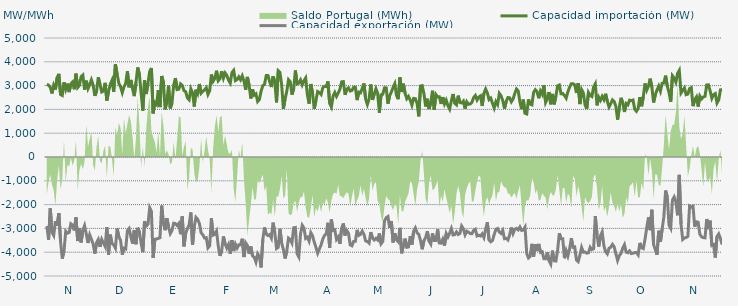
| Category | Capacidad importación (MW) | Capacidad exportación (MW) |
|---|---|---|
| 0 | 3058.125 | -2902.5 |
| 1900-01-01 | 3018.75 | -3474.375 |
| 1900-01-02 | 2925.625 | -2158.375 |
| 1900-01-03 | 2670.667 | -3157.5 |
| 1900-01-04 | 3015 | -3296.25 |
| 1900-01-05 | 2835.25 | -2693.125 |
| 1900-01-06 | 3337.5 | -2882.083 |
| 1900-01-07 | 3493.125 | -2358.75 |
| 1900-01-08 | 2626.042 | -3555 |
| 1900-01-09 | 2583.542 | -4267.5 |
| 1900-01-10 | 3140.625 | -3948.75 |
| 1900-01-11 | 2844.375 | -3122.5 |
| 1900-01-12 | 3082.5 | -3200.625 |
| 1900-01-13 | 2726.25 | -3170.625 |
| 1900-01-14 | 3071.25 | -2806.875 |
| 1900-01-15 | 3151.875 | -2865 |
| 1900-01-16 | 2845.417 | -3084.375 |
| 1900-01-17 | 3500.625 | -2536.875 |
| 1900-01-18 | 2921.75 | -3531.625 |
| 1900-01-19 | 3012.625 | -2985.75 |
| 1900-01-20 | 3378.75 | -3590.625 |
| 1900-01-21 | 3442.5 | -3078.75 |
| 1900-01-22 | 2829.167 | -2881.042 |
| 1900-01-23 | 3205.833 | -3234.375 |
| 1900-01-24 | 2873.625 | -3613.125 |
| 1900-01-25 | 3038.333 | -3270 |
| 1900-01-26 | 3245.625 | -3459.375 |
| 1900-01-27 | 3029.167 | -3656.25 |
| 1900-01-28 | 2571.042 | -4057.5 |
| 1900-01-29 | 2766.125 | -3596.417 |
| 1900-01-30 | 3348.75 | -3465 |
| 1900-01-31 | 3046.333 | -3774.375 |
| 1900-02-01 | 2732.708 | -3460.042 |
| 1900-02-02 | 2770.75 | -3616.875 |
| 1900-02-03 | 3116.25 | -3757.75 |
| 1900-02-04 | 2370.5 | -2949.375 |
| 1900-02-05 | 2758.625 | -4102.5 |
| 1900-02-06 | 3054.167 | -3262.5 |
| 1900-02-07 | 3221.875 | -3637.5 |
| 1900-02-08 | 2734.792 | -3695.625 |
| 1900-02-09 | 3901.875 | -3830.625 |
| 1900-02-10 | 3478.125 | -3007.5 |
| 1900-02-11 | 3100.208 | -3343.125 |
| 1900-02-12 | 2951.458 | -3500.625 |
| 1900-02-13 | 2703.125 | -4100.625 |
| 1900-02-14 | 2949.667 | -3832.5 |
| 1900-02-15 | 3092.292 | -3864.375 |
| 1900-02-16 | 3609.375 | -3088.125 |
| 1900-02-17 | 2928.75 | -3003.75 |
| 1900-02-18 | 3238.333 | -3346.875 |
| 1900-02-19 | 2865.417 | -3639.375 |
| 1900-02-20 | 2557.917 | -3067.5 |
| 1900-02-21 | 3131.667 | -3665.625 |
| 1900-02-22 | 3761.25 | -2973.625 |
| 1900-02-23 | 3468.542 | -3153.75 |
| 1900-02-24 | 2673.75 | -3622.5 |
| 1900-02-25 | 1945.625 | -3999.375 |
| 1900-02-26 | 3222.083 | -2703.875 |
| 1900-02-27 | 2645.458 | -2900.625 |
| 1900-02-28 | 3097.5 | -2827.5 |
| 1900-02-28 | 3595.208 | -2128.75 |
| 1900-03-01 | 3741.458 | -2283.75 |
| 1900-03-02 | 1833.125 | -4242.5 |
| 1900-03-03 | 2294.25 | -3457.125 |
| 1900-03-04 | 2210.833 | -3444.375 |
| 1900-03-05 | 2808.75 | -3420 |
| 1900-03-06 | 2098.083 | -3391.875 |
| 1900-03-07 | 3404.792 | -2041.875 |
| 1900-03-08 | 3136.875 | -2790.292 |
| 1900-03-09 | 2001.25 | -3075.75 |
| 1900-03-10 | 2334.583 | -2570.625 |
| 1900-03-11 | 2998.542 | -2932.5 |
| 1900-03-12 | 2041.583 | -3219.375 |
| 1900-03-13 | 2261.875 | -3091.875 |
| 1900-03-14 | 3017.292 | -2780.625 |
| 1900-03-15 | 3316.667 | -2796 |
| 1900-03-16 | 2831.875 | -2880.375 |
| 1900-03-17 | 2848.875 | -2791.375 |
| 1900-03-18 | 3072.083 | -3242.5 |
| 1900-03-19 | 3008.75 | -2494.125 |
| 1900-03-20 | 2789.75 | -3753.75 |
| 1900-03-21 | 2740.75 | -3208.125 |
| 1900-03-22 | 2484.167 | -3015 |
| 1900-03-23 | 2405.083 | -2845.208 |
| 1900-03-24 | 2862.542 | -2330.625 |
| 1900-03-25 | 2704.875 | -3693.75 |
| 1900-03-26 | 2121.458 | -2932.25 |
| 1900-03-27 | 2826.875 | -2536.458 |
| 1900-03-28 | 2666.25 | -2617.875 |
| 1900-03-29 | 3068.375 | -2797.625 |
| 1900-03-30 | 2681.458 | -3181.875 |
| 1900-03-31 | 2762.167 | -3268.125 |
| 1900-04-01 | 2816.458 | -3403.125 |
| 1900-04-02 | 2908.75 | -3388.125 |
| 1900-04-03 | 2628.458 | -3817.5 |
| 1900-04-04 | 2784.5 | -3729.375 |
| 1900-04-05 | 3466.875 | -2575.375 |
| 1900-04-06 | 3180 | -3284.375 |
| 1900-04-07 | 3301.25 | -3251.25 |
| 1900-04-08 | 3624.375 | -3114.375 |
| 1900-04-09 | 3203.333 | -3733.125 |
| 1900-04-10 | 3288.125 | -4155 |
| 1900-04-11 | 3606.25 | -3943.125 |
| 1900-04-12 | 3313.75 | -3335.625 |
| 1900-04-13 | 3531.417 | -3646.875 |
| 1900-04-14 | 3433.125 | -3826.875 |
| 1900-04-15 | 3223.542 | -3673.333 |
| 1900-04-16 | 3103.75 | -4066.875 |
| 1900-04-17 | 3546.25 | -3496.875 |
| 1900-04-18 | 3638.5 | -3952.5 |
| 1900-04-19 | 3210 | -3661.875 |
| 1900-04-20 | 3255.417 | -3826.875 |
| 1900-04-21 | 3367.5 | -3690 |
| 1900-04-22 | 3244.5 | -3684.375 |
| 1900-04-23 | 3411.458 | -3435 |
| 1900-04-24 | 3192.708 | -4203.75 |
| 1900-04-25 | 2825 | -3605.625 |
| 1900-04-26 | 3365.667 | -3718.625 |
| 1900-04-27 | 3014.375 | -4063.125 |
| 1900-04-28 | 2458.292 | -3762 |
| 1900-04-29 | 2845.5 | -4151.25 |
| 1900-04-30 | 2597.292 | -4215 |
| 1900-05-01 | 2650.375 | -4415.625 |
| 1900-05-02 | 2331.042 | -4066.875 |
| 1900-05-03 | 2415.625 | -4185 |
| 1900-05-04 | 2763.875 | -4638.75 |
| 1900-05-05 | 2996.042 | -3465 |
| 1900-05-06 | 3054.375 | -2960.625 |
| 1900-05-07 | 3421.875 | -3238.875 |
| 1900-05-08 | 3422.25 | -3301.458 |
| 1900-05-09 | 3168.75 | -3257.708 |
| 1900-05-10 | 2940.75 | -3407.5 |
| 1900-05-11 | 3391.875 | -2758.75 |
| 1900-05-12 | 3159.375 | -3175.208 |
| 1900-05-13 | 2294.792 | -3843.75 |
| 1900-05-14 | 3620.625 | -3793.125 |
| 1900-05-15 | 3550.208 | -3016.875 |
| 1900-05-16 | 3036.458 | -3616.875 |
| 1900-05-17 | 2023.333 | -3886.25 |
| 1900-05-18 | 2440.208 | -4263.75 |
| 1900-05-19 | 2764.167 | -3943.125 |
| 1900-05-20 | 3245.625 | -3410.667 |
| 1900-05-21 | 3161.25 | -3470.625 |
| 1900-05-22 | 2621.458 | -3614.625 |
| 1900-05-23 | 2861.25 | -2975.958 |
| 1900-05-24 | 3635.217 | -2962.391 |
| 1900-05-25 | 3071.083 | -4052.75 |
| 1900-05-26 | 3103.625 | -4196.25 |
| 1900-05-27 | 3238.125 | -3235.75 |
| 1900-05-28 | 3031.875 | -2868.708 |
| 1900-05-29 | 3202.5 | -2981.292 |
| 1900-05-30 | 3320.625 | -3422.292 |
| 1900-05-31 | 2615.625 | -3370.417 |
| 1900-06-01 | 2244.375 | -3535.625 |
| 1900-06-02 | 3067.5 | -3176.25 |
| 1900-06-03 | 2692.458 | -3306.875 |
| 1900-06-04 | 2025 | -3576.042 |
| 1900-06-05 | 2373.833 | -3795 |
| 1900-06-06 | 2750.458 | -4045 |
| 1900-06-07 | 2704.167 | -3868.417 |
| 1900-06-08 | 2628.75 | -3691.667 |
| 1900-06-09 | 2910 | -3448.125 |
| 1900-06-10 | 2971.875 | -3293.375 |
| 1900-06-11 | 2958.5 | -3229.167 |
| 1900-06-12 | 3174.375 | -2764.583 |
| 1900-06-13 | 2253.75 | -3813.75 |
| 1900-06-14 | 2100 | -2628.667 |
| 1900-06-15 | 2557.5 | -3088.333 |
| 1900-06-16 | 2713.125 | -3062.25 |
| 1900-06-17 | 2546.875 | -3463.625 |
| 1900-06-18 | 2686.458 | -3359.458 |
| 1900-06-19 | 2850 | -3646.042 |
| 1900-06-20 | 3159.375 | -2992.292 |
| 1900-06-21 | 3166.875 | -2793.125 |
| 1900-06-22 | 2613.75 | -3298.833 |
| 1900-06-23 | 2857.5 | -3089.625 |
| 1900-06-24 | 2903.875 | -3210.125 |
| 1900-06-25 | 2772 | -3696.792 |
| 1900-06-26 | 2797.5 | -3731.25 |
| 1900-06-27 | 2930.625 | -3545.625 |
| 1900-06-28 | 2932.5 | -3541.875 |
| 1900-06-29 | 2390.625 | -3064.167 |
| 1900-06-30 | 2726.25 | -3293.333 |
| 1900-07-01 | 2694.375 | -3252.708 |
| 1900-07-02 | 2878.125 | -3111.875 |
| 1900-07-03 | 3088.125 | -3247.5 |
| 1900-07-04 | 2435.625 | -3528.958 |
| 1900-07-05 | 2206.875 | -3547.708 |
| 1900-07-06 | 2435.625 | -3618.75 |
| 1900-07-07 | 3046.875 | -3157.917 |
| 1900-07-08 | 2400 | -3406.875 |
| 1900-07-09 | 2640 | -3488.125 |
| 1900-07-10 | 2866.875 | -3413.542 |
| 1900-07-11 | 2675.625 | -3486.458 |
| 1900-07-12 | 1861.25 | -3211.667 |
| 1900-07-13 | 2611.875 | -3644.375 |
| 1900-07-14 | 2638.125 | -3547.083 |
| 1900-07-15 | 2906.25 | -2688.333 |
| 1900-07-16 | 2904.375 | -2549.583 |
| 1900-07-17 | 2240.625 | -2502.083 |
| 1900-07-18 | 2576.25 | -2981.667 |
| 1900-07-19 | 2732.25 | -2689.375 |
| 1900-07-20 | 2919.375 | -3586.875 |
| 1900-07-21 | 3078.75 | -3206.25 |
| 1900-07-22 | 2587.5 | -3481.875 |
| 1900-07-23 | 2430 | -3560.625 |
| 1900-07-24 | 3341.25 | -2977.542 |
| 1900-07-25 | 2733.75 | -4046.25 |
| 1900-07-26 | 3080.625 | -3725.417 |
| 1900-07-27 | 2681.25 | -3429.375 |
| 1900-07-28 | 2448.75 | -3793.125 |
| 1900-07-29 | 2544.125 | -3778.125 |
| 1900-07-30 | 2394.958 | -3328.125 |
| 1900-07-31 | 2175 | -3678.75 |
| 1900-08-01 | 2461.167 | -3117.375 |
| 1900-08-02 | 2448.75 | -2981.542 |
| 1900-08-03 | 2255.042 | -3185.833 |
| 1900-08-04 | 1708.042 | -3250.208 |
| 1900-08-05 | 2981.25 | -3508.125 |
| 1900-08-06 | 2998.125 | -3877.5 |
| 1900-08-07 | 2664.375 | -3519.375 |
| 1900-08-08 | 2124.375 | -3382.5 |
| 1900-08-09 | 2446.875 | -3115.792 |
| 1900-08-10 | 2015.417 | -3534.375 |
| 1900-08-11 | 2289.375 | -3658.125 |
| 1900-08-12 | 2784.375 | -3211.083 |
| 1900-08-13 | 1993.125 | -3504.792 |
| 1900-08-14 | 2624.875 | -3506.458 |
| 1900-08-15 | 2523.75 | -3042.583 |
| 1900-08-16 | 2531.25 | -3613.125 |
| 1900-08-17 | 2229.583 | -3620.625 |
| 1900-08-18 | 2515.875 | -3455.625 |
| 1900-08-19 | 2227.5 | -3723.75 |
| 1900-08-20 | 2388.375 | -3217.458 |
| 1900-08-21 | 2157.875 | -3361.542 |
| 1900-08-22 | 2014.583 | -3202.708 |
| 1900-08-23 | 2357.917 | -3006.583 |
| 1900-08-24 | 2647.75 | -3275.625 |
| 1900-08-25 | 2259.375 | -3258.75 |
| 1900-08-26 | 2191.875 | -3148.125 |
| 1900-08-27 | 2578.125 | -3256.875 |
| 1900-08-28 | 2289.375 | -3211.875 |
| 1900-08-29 | 2272.917 | -2898.25 |
| 1900-08-30 | 2349.75 | -3012.25 |
| 1900-08-31 | 2034.167 | -3270 |
| 1900-09-01 | 2319.375 | -3116.25 |
| 1900-09-02 | 2214.375 | -3159.375 |
| 1900-09-03 | 2229.167 | -3217.5 |
| 1900-09-04 | 2296.875 | -3223.125 |
| 1900-09-05 | 2497.5 | -3080.208 |
| 1900-09-06 | 2585.5 | -3034.292 |
| 1900-09-07 | 2394.375 | -3318.75 |
| 1900-09-08 | 2520 | -3286.875 |
| 1900-09-09 | 2570.625 | -3320.625 |
| 1900-09-10 | 2145 | -3229.583 |
| 1900-09-11 | 2673.75 | -3384.375 |
| 1900-09-12 | 2855.625 | -3040.333 |
| 1900-09-13 | 2689.875 | -2741.708 |
| 1900-09-14 | 2413.125 | -3485.625 |
| 1900-09-15 | 2476.875 | -3564.375 |
| 1900-09-16 | 2258.75 | -3510 |
| 1900-09-17 | 2056.875 | -3258.75 |
| 1900-09-18 | 2326.875 | -3036.667 |
| 1900-09-19 | 2203.125 | -3003.75 |
| 1900-09-20 | 2675.333 | -3153.417 |
| 1900-09-21 | 2572.5 | -3211.875 |
| 1900-09-22 | 2368.125 | -3082.917 |
| 1900-09-23 | 2032.5 | -3433.125 |
| 1900-09-24 | 2340 | -3418.125 |
| 1900-09-25 | 2499.375 | -3485.625 |
| 1900-09-26 | 2488.125 | -3277.5 |
| 1900-09-27 | 2317.5 | -2963.167 |
| 1900-09-28 | 2431.875 | -3217.5 |
| 1900-09-29 | 2668.125 | -3039.375 |
| 1900-09-30 | 2855.625 | -2998.125 |
| 1900-10-01 | 2778.75 | -3061.667 |
| 1900-10-02 | 2311.875 | -2941.042 |
| 1900-10-03 | 2010 | -3084.375 |
| 1900-10-04 | 2411.25 | -3065.625 |
| 1900-10-05 | 1837.917 | -2945.625 |
| 1900-10-06 | 1809.167 | -4055.625 |
| 1900-10-07 | 2419.792 | -4241.25 |
| 1900-10-08 | 2227.5 | -4173.75 |
| 1900-10-09 | 2191.875 | -3648.75 |
| 1900-10-10 | 2715 | -4183.125 |
| 1900-10-11 | 2826.625 | -3667.292 |
| 1900-10-12 | 2745 | -3950.625 |
| 1900-10-13 | 2467.5 | -3652.625 |
| 1900-10-14 | 2771.25 | -4006.875 |
| 1900-10-15 | 2640 | -3980.625 |
| 1900-10-16 | 3016.875 | -4271.25 |
| 1900-10-17 | 2292.292 | -4271.25 |
| 1900-10-18 | 2448.75 | -4010.625 |
| 1900-10-19 | 2730 | -4357.5 |
| 1900-10-20 | 2214.75 | -4501.875 |
| 1900-10-21 | 2650.208 | -3931.667 |
| 1900-10-22 | 2212.5 | -4361.25 |
| 1900-10-23 | 2565 | -4370.625 |
| 1900-10-24 | 2988.75 | -3920.625 |
| 1900-10-25 | 3024.375 | -3204.083 |
| 1900-10-26 | 2656.875 | -3437.708 |
| 1900-10-27 | 2664.375 | -3437.5 |
| 1900-10-28 | 2587.5 | -4254.375 |
| 1900-10-29 | 2473.125 | -3939.583 |
| 1900-10-30 | 2737.5 | -4156.875 |
| 1900-10-31 | 2932.5 | -3862.5 |
| 1900-11-01 | 3080.625 | -3412.708 |
| 1900-11-02 | 3078.125 | -3793.125 |
| 1900-11-03 | 3031.25 | -3776.25 |
| 1900-11-04 | 2689.875 | -4331.25 |
| 1900-11-05 | 3104.042 | -4396.875 |
| 1900-11-06 | 2223.25 | -4126.875 |
| 1900-11-07 | 2830.208 | -3799.583 |
| 1900-11-08 | 2694.375 | -3999.792 |
| 1900-11-09 | 2193.542 | -3994.167 |
| 1900-11-10 | 2019.375 | -4039.792 |
| 1900-11-11 | 2710.792 | -4026.667 |
| 1900-11-12 | 2589.292 | -3790.625 |
| 1900-11-13 | 2542.5 | -3888.75 |
| 1900-11-14 | 2943.75 | -3856.875 |
| 1900-11-15 | 3076.875 | -2486 |
| 1900-11-16 | 2169.583 | -3271.875 |
| 1900-11-17 | 2510.875 | -3762.292 |
| 1900-11-18 | 2379.375 | -3315.625 |
| 1900-11-19 | 2548.125 | -3149.875 |
| 1900-11-20 | 2405.625 | -3725.625 |
| 1900-11-21 | 2655.792 | -3978.75 |
| 1900-11-22 | 2338.917 | -4070.625 |
| 1900-11-23 | 2100.75 | -3836.25 |
| 1900-11-24 | 2239.583 | -3791.25 |
| 1900-11-25 | 2398.417 | -3671.25 |
| 1900-11-26 | 2333.375 | -3772.5 |
| 1900-11-27 | 2128.125 | -4065 |
| 1900-11-28 | 1568.375 | -4348.125 |
| 1900-11-29 | 2080.083 | -4146.125 |
| 1900-11-30 | 2486.208 | -4052.083 |
| 1900-12-01 | 2275.5 | -3824.583 |
| 1900-12-02 | 1891.708 | -3681.25 |
| 1900-12-03 | 2248.292 | -4001.25 |
| 1900-12-04 | 2190.75 | -4023.75 |
| 1900-12-05 | 2386.583 | -3945 |
| 1900-12-06 | 2366.708 | -4057.5 |
| 1900-12-07 | 2393.375 | -4042.25 |
| 1900-12-08 | 2007.375 | -4017.708 |
| 1900-12-09 | 1918.833 | -4016.25 |
| 1900-12-10 | 2042.417 | -4115.625 |
| 1900-12-11 | 2516.25 | -3611.25 |
| 1900-12-12 | 2132.708 | -3815.625 |
| 1900-12-13 | 2530.208 | -3849.375 |
| 1900-12-14 | 3090 | -3459.375 |
| 1900-12-15 | 2808.75 | -2974.875 |
| 1900-12-16 | 2978.125 | -2539.125 |
| 1900-12-17 | 3292.5 | -3075.208 |
| 1900-12-18 | 2935 | -2217.083 |
| 1900-12-19 | 2289.583 | -3673.125 |
| 1900-12-20 | 2619.375 | -3890.625 |
| 1900-12-21 | 2814.792 | -4110 |
| 1900-12-22 | 2979.375 | -3099.375 |
| 1900-12-23 | 2767.5 | -3556.875 |
| 1900-12-24 | 3099.375 | -3031.875 |
| 1900-12-25 | 3111.25 | -2508.75 |
| 1900-12-26 | 3418.125 | -1406.875 |
| 1900-12-27 | 2979.6 | -1681.6 |
| 1900-12-28 | 2705.333 | -2868.75 |
| 1900-12-29 | 2324.458 | -2999 |
| 1900-12-30 | 3414.375 | -1815.417 |
| 1900-12-31 | 3313.125 | -1677.917 |
| 1901-01-01 | 3144.583 | -1882.667 |
| 1901-01-02 | 3511.875 | -2448.75 |
| 1901-01-03 | 3639.375 | -750.708 |
| 1901-01-04 | 2688.958 | -2820 |
| 1901-01-05 | 2797.542 | -3465 |
| 1901-01-06 | 2902.5 | -3399.375 |
| 1901-01-07 | 2618.042 | -3382.5 |
| 1901-01-08 | 2643.417 | -3336.125 |
| 1901-01-09 | 2878.125 | -2058.75 |
| 1901-01-10 | 2915 | -2101.875 |
| 1901-01-11 | 2137.708 | -2068.125 |
| 1901-01-12 | 2411.042 | -2928.75 |
| 1901-01-13 | 2524.375 | -2722.5 |
| 1901-01-14 | 2118.542 | -2739.375 |
| 1901-01-15 | 2559.458 | -3244.292 |
| 1901-01-16 | 2440.833 | -3354.75 |
| 1901-01-17 | 2521.167 | -3387.25 |
| 1901-01-18 | 2546.333 | -3396.375 |
| 1901-01-19 | 3028.125 | -2606.25 |
| 1901-01-20 | 3031.875 | -3030 |
| 1901-01-21 | 2773.917 | -2675.625 |
| 1901-01-22 | 2465.417 | -3720 |
| 1901-01-23 | 2620.708 | -3684.375 |
| 1901-01-24 | 2665.625 | -4224.375 |
| 1901-01-25 | 2266.875 | -3343.125 |
| 1901-01-26 | 2395.625 | -3230.625 |
| 1901-01-27 | 2820.417 | -3421.875 |
| 1901-01-28 | 2831.667 | -3678.75 |